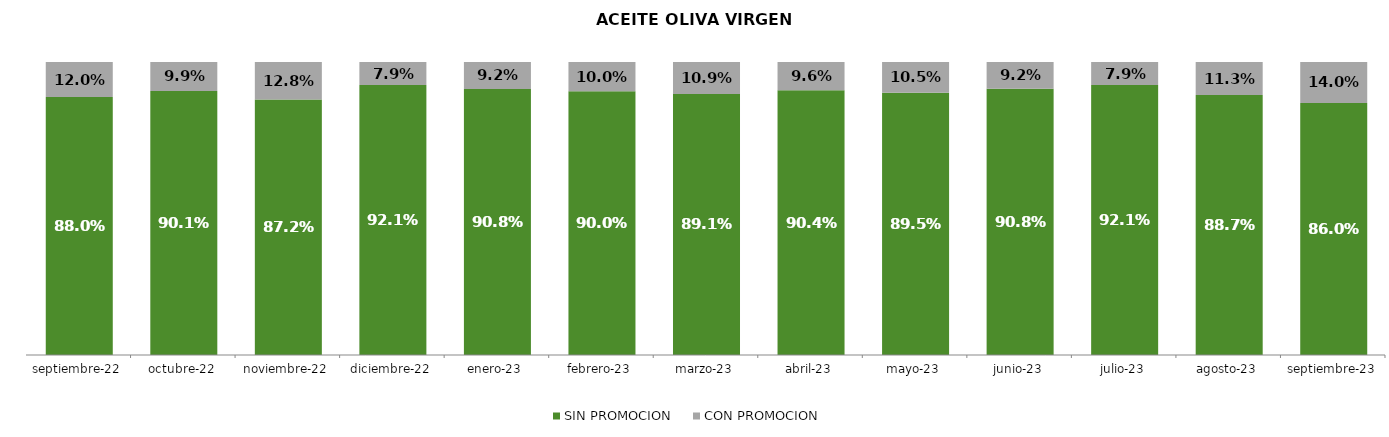
| Category | SIN PROMOCION   | CON PROMOCION   |
|---|---|---|
| 2022-09-01 | 0.88 | 0.12 |
| 2022-10-01 | 0.901 | 0.099 |
| 2022-11-01 | 0.872 | 0.128 |
| 2022-12-01 | 0.921 | 0.079 |
| 2023-01-01 | 0.908 | 0.092 |
| 2023-02-01 | 0.9 | 0.1 |
| 2023-03-01 | 0.891 | 0.109 |
| 2023-04-01 | 0.904 | 0.096 |
| 2023-05-01 | 0.895 | 0.105 |
| 2023-06-01 | 0.908 | 0.092 |
| 2023-07-01 | 0.921 | 0.079 |
| 2023-08-01 | 0.887 | 0.113 |
| 2023-09-01 | 0.86 | 0.14 |